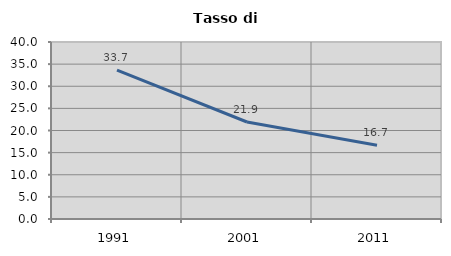
| Category | Tasso di disoccupazione   |
|---|---|
| 1991.0 | 33.667 |
| 2001.0 | 21.919 |
| 2011.0 | 16.662 |